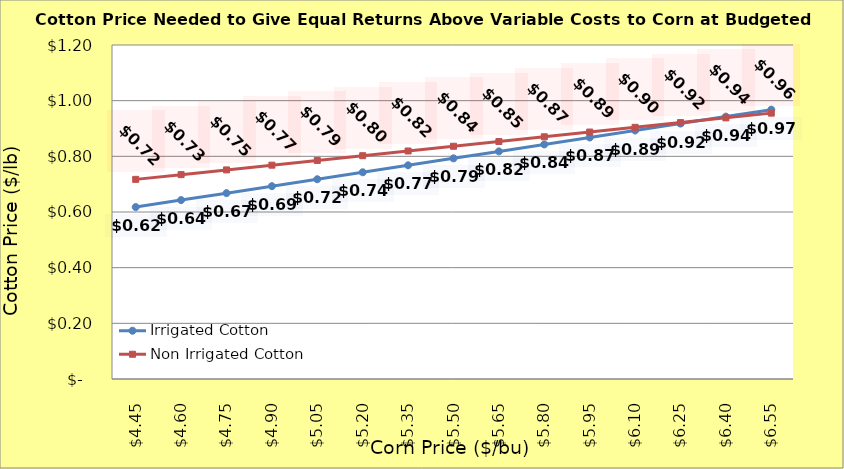
| Category | Irrigated Cotton | Non Irrigated Cotton |
|---|---|---|
| 4.4499999999999975 | 0.618 | 0.717 |
| 4.599999999999998 | 0.643 | 0.734 |
| 4.749999999999998 | 0.668 | 0.751 |
| 4.899999999999999 | 0.693 | 0.768 |
| 5.049999999999999 | 0.718 | 0.785 |
| 5.199999999999999 | 0.743 | 0.802 |
| 5.35 | 0.768 | 0.819 |
| 5.5 | 0.793 | 0.836 |
| 5.65 | 0.818 | 0.853 |
| 5.800000000000001 | 0.843 | 0.87 |
| 5.950000000000001 | 0.868 | 0.887 |
| 6.100000000000001 | 0.893 | 0.904 |
| 6.250000000000002 | 0.918 | 0.921 |
| 6.400000000000002 | 0.943 | 0.938 |
| 6.5500000000000025 | 0.968 | 0.955 |